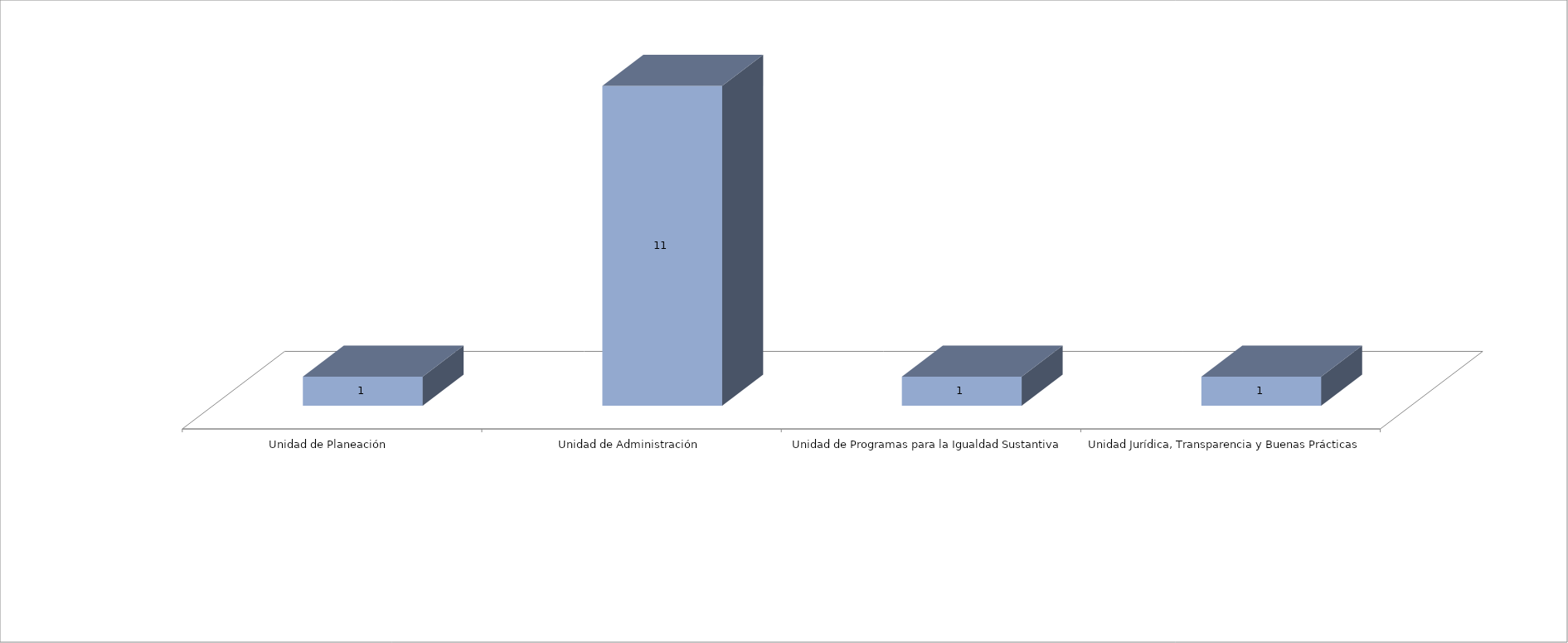
| Category | Series 0 | Series 1 |
|---|---|---|
| Unidad de Planeación  |  | 1 |
| Unidad de Administración |  | 11 |
| Unidad de Programas para la Igualdad Sustantiva |  | 1 |
| Unidad Jurídica, Transparencia y Buenas Prácticas  |  | 1 |